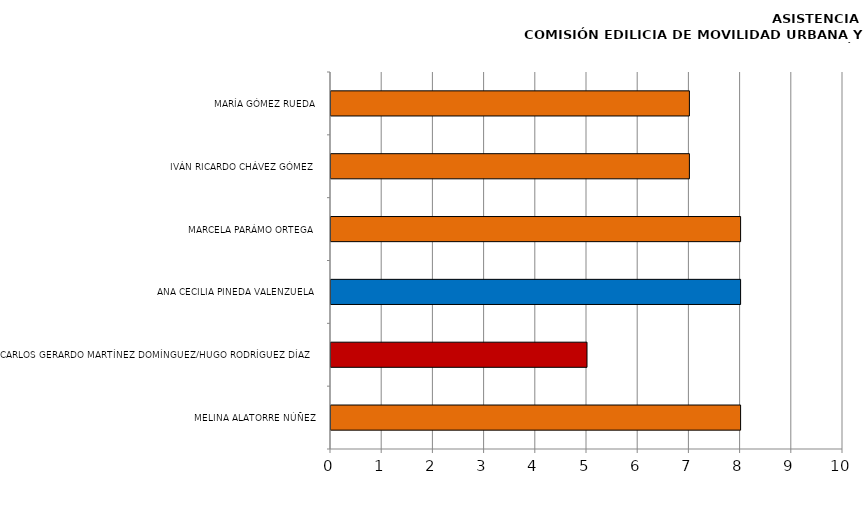
| Category | Series 0 |
|---|---|
| MELINA ALATORRE NÚÑEZ | 8 |
| CARLOS GERARDO MARTÍNEZ DOMÍNGUEZ/HUGO RODRÍGUEZ DÍAZ | 5 |
| ANA CECILIA PINEDA VALENZUELA | 8 |
| MARCELA PARÁMO ORTEGA | 8 |
| IVÁN RICARDO CHÁVEZ GÓMEZ | 7 |
| MARÍA GÓMEZ RUEDA | 7 |